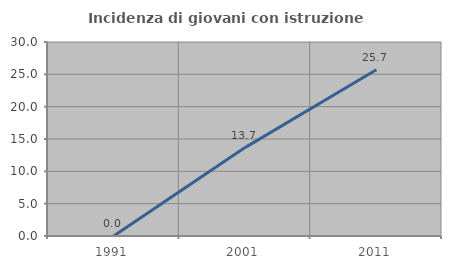
| Category | Incidenza di giovani con istruzione universitaria |
|---|---|
| 1991.0 | 0 |
| 2001.0 | 13.669 |
| 2011.0 | 25.698 |